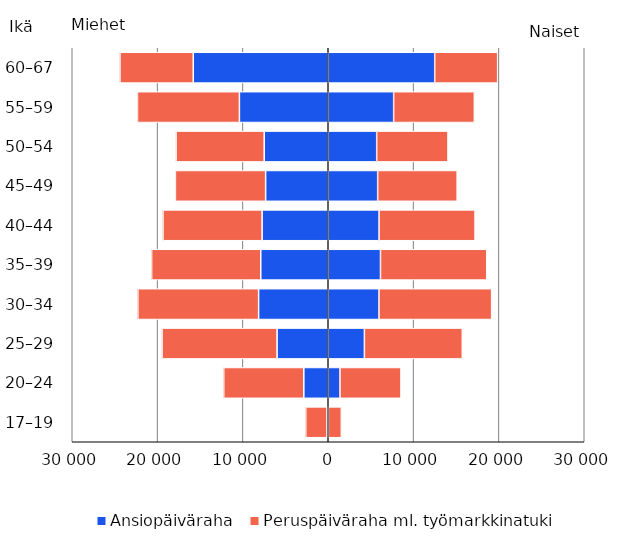
| Category | Ansiopäiväraha | Peruspäiväraha ml. työmarkkinatuki | Series 2 | Series 3 |
|---|---|---|---|---|
| 17–19 | -145 | -2491 | 15 | 1518 |
| 20–24 | -2862 | -9385 | 1374 | 7146 |
| 25–29 | -5998 | -13475 | 4236 | 11473 |
| 30–34 | -8160 | -14151 | 5945 | 13201 |
| 35–39 | -7907 | -12790 | 6123 | 12452 |
| 40–44 | -7749 | -11618 | 5956 | 11250 |
| 45–49 | -7338 | -10575 | 5790 | 9319 |
| 50–54 | -7505 | -10324 | 5678 | 8354 |
| 55–59 | -10410 | -11947 | 7663 | 9462 |
| 60–67 | -15819 | -8586 | 12475 | 7377 |